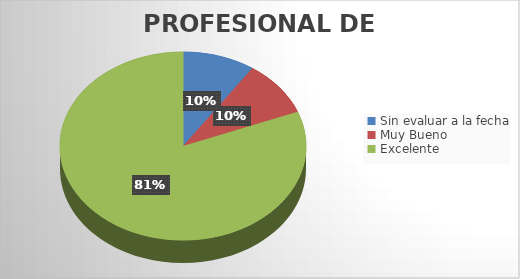
| Category | Cantidad |
|---|---|
| Sin evaluar a la fecha | 2 |
| Muy Bueno | 2 |
| Excelente | 17 |